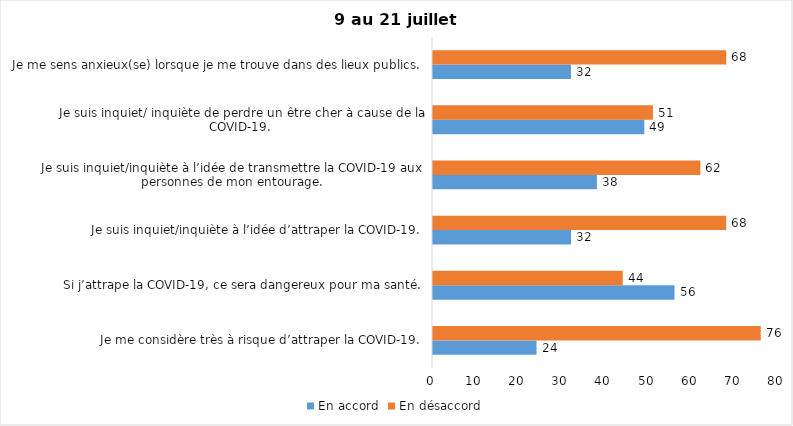
| Category | En accord | En désaccord |
|---|---|---|
| Je me considère très à risque d’attraper la COVID-19. | 24 | 76 |
| Si j’attrape la COVID-19, ce sera dangereux pour ma santé. | 56 | 44 |
| Je suis inquiet/inquiète à l’idée d’attraper la COVID-19. | 32 | 68 |
| Je suis inquiet/inquiète à l’idée de transmettre la COVID-19 aux personnes de mon entourage. | 38 | 62 |
| Je suis inquiet/ inquiète de perdre un être cher à cause de la COVID-19. | 49 | 51 |
| Je me sens anxieux(se) lorsque je me trouve dans des lieux publics. | 32 | 68 |